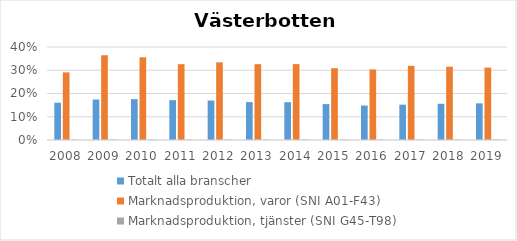
| Category | Totalt alla branscher | Marknadsproduktion, varor (SNI A01-F43) | Marknadsproduktion, tjänster (SNI G45-T98) |
|---|---|---|---|
| 2008 | 0.16 | 0.291 | 0.002 |
| 2009 | 0.174 | 0.365 | 0.002 |
| 2010 | 0.176 | 0.356 | 0.002 |
| 2011 | 0.171 | 0.326 | 0.002 |
| 2012 | 0.17 | 0.334 | 0.002 |
| 2013 | 0.163 | 0.326 | 0.002 |
| 2014 | 0.163 | 0.326 | 0.002 |
| 2015 | 0.154 | 0.309 | 0.002 |
| 2016 | 0.148 | 0.303 | 0.002 |
| 2017 | 0.152 | 0.319 | 0.002 |
| 2018 | 0.156 | 0.315 | 0.002 |
| 2019 | 0.158 | 0.311 | 0.002 |